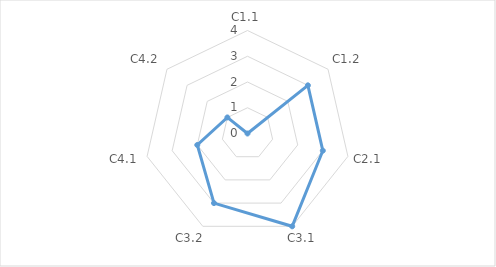
| Category | Series 0 | "" | 1 | 2 | 3 | 4 |
|---|---|---|---|---|---|---|
| C1.1 | 0 |  |  |  |  |  |
| C1.2 | 3 |  |  |  |  |  |
| C2.1 | 3 |  |  |  |  |  |
| C3.1 | 4 |  |  |  |  |  |
| C3.2 | 3 |  |  |  |  |  |
| C4.1 | 2 |  |  |  |  |  |
| C4.2 | 1 |  |  |  |  |  |